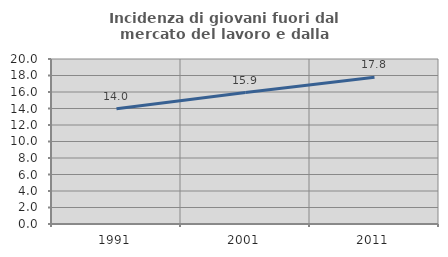
| Category | Incidenza di giovani fuori dal mercato del lavoro e dalla formazione  |
|---|---|
| 1991.0 | 13.96 |
| 2001.0 | 15.927 |
| 2011.0 | 17.783 |